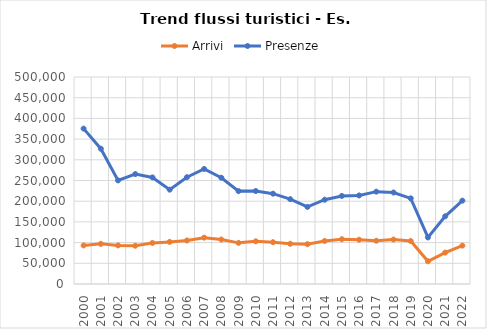
| Category | Arrivi | Presenze |
|---|---|---|
| 2000.0 | 93154 | 375321 |
| 2001.0 | 96989 | 326779 |
| 2002.0 | 93275 | 250237 |
| 2003.0 | 92464 | 265485 |
| 2004.0 | 99235 | 257422 |
| 2005.0 | 101735 | 227879 |
| 2006.0 | 105098 | 257890 |
| 2007.0 | 111957 | 277896 |
| 2008.0 | 107437 | 256731 |
| 2009.0 | 99391 | 224340 |
| 2010.0 | 103067 | 224567 |
| 2011.0 | 100977 | 218190 |
| 2012.0 | 97181 | 204875 |
| 2013.0 | 96231 | 186228 |
| 2014.0 | 103905 | 203557 |
| 2015.0 | 108161 | 212686 |
| 2016.0 | 106998 | 213891 |
| 2017.0 | 104526 | 223061 |
| 2018.0 | 107364 | 221024 |
| 2019.0 | 103801 | 206905 |
| 2020.0 | 54874 | 112467 |
| 2021.0 | 75800 | 163499 |
| 2022.0 | 92685 | 201365 |